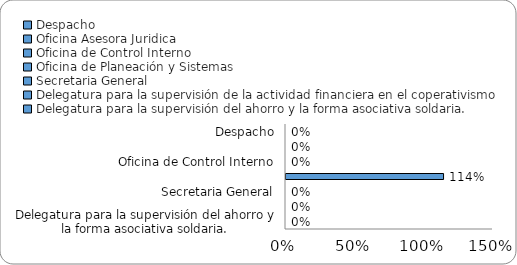
| Category | Eficacia |
|---|---|
| Despacho | 0 |
| Oficina Asesora Juridica | 0 |
| Oficina de Control Interno | 0 |
| Oficina de Planeación y Sistemas | 1.142 |
| Secretaria General | 0 |
| Delegatura para la supervisión de la actividad financiera en el coperativismo | 0 |
| Delegatura para la supervisión del ahorro y la forma asociativa soldaria. | 0 |